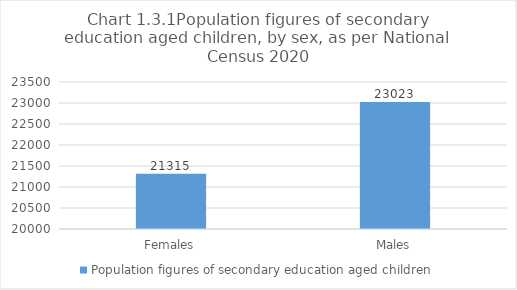
| Category | Population figures of secondary education aged children |
|---|---|
| Females | 21315.371 |
| Males | 23022.765 |